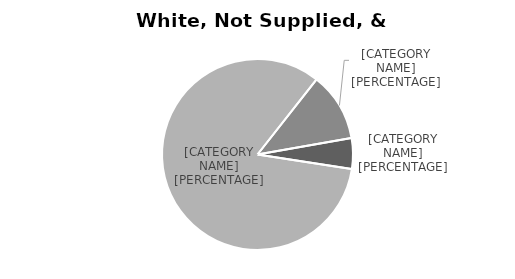
| Category | Series 0 |
|---|---|
| Not Supplied | 336 |
| White/Non Hispanic | 5351 |
| International | 747 |